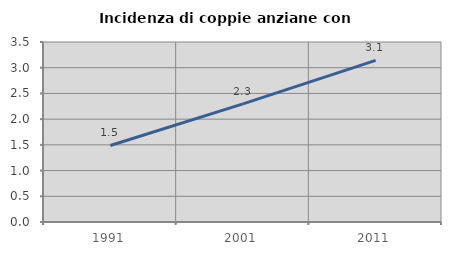
| Category | Incidenza di coppie anziane con figli |
|---|---|
| 1991.0 | 1.488 |
| 2001.0 | 2.296 |
| 2011.0 | 3.142 |